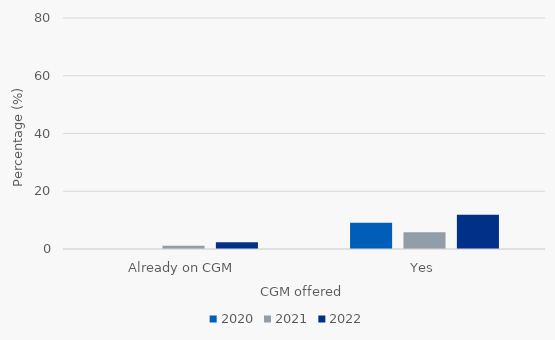
| Category | 2020 | 2021 | 2022 |
|---|---|---|---|
| Already on CGM | 0 | 1.154 | 2.31 |
| Yes | 9.091 | 5.769 | 11.881 |